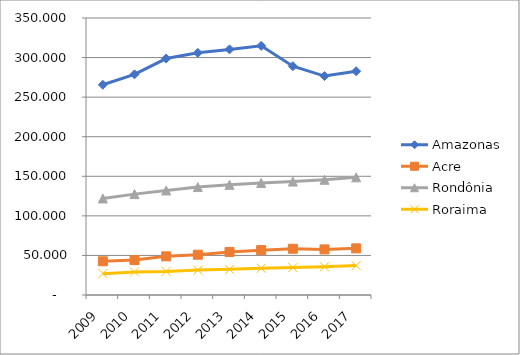
| Category | Amazonas | Acre | Rondônia | Roraima |
|---|---|---|---|---|
| 2009.0 | 265.615 | 42.605 | 121.976 | 26.992 |
| 2010.0 | 278.812 | 44.138 | 127.468 | 29.081 |
| 2011.0 | 298.773 | 48.844 | 132.124 | 29.787 |
| 2012.0 | 305.972 | 50.886 | 136.373 | 31.458 |
| 2013.0 | 310.311 | 54.408 | 139.264 | 32.449 |
| 2014.0 | 314.823 | 56.686 | 141.611 | 33.8 |
| 2015.0 | 289.098 | 58.436 | 143.334 | 34.608 |
| 2016.0 | 276.62 | 57.613 | 145.571 | 35.736 |
| 2017.0 | 282.773 | 58.914 | 148.709 | 37.149 |